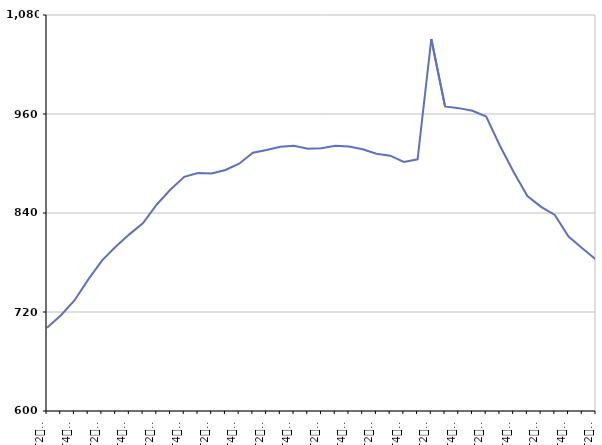
| Category | 50 ans ou plus |
|---|---|
| T2
2013 | 701 |
| T3
2013 | 715.7 |
| T4
2013 | 734 |
| T1
2014 | 759.2 |
| T2
2014 | 782.3 |
| T3
2014 | 799 |
| T4
2014 | 814.1 |
| T1
2015 | 827.8 |
| T2
2015 | 850.3 |
| T3
2015 | 868.4 |
| T4
2015 | 883.8 |
| T1
2016 | 888.4 |
| T2
2016 | 888 |
| T3
2016 | 892.2 |
| T4
2016 | 899.8 |
| T1
2017 | 913 |
| T2
2017 | 916.3 |
| T3
2017 | 920.4 |
| T4
2017 | 921.6 |
| T1
2018 | 917.8 |
| T2
2018 | 918.5 |
| T3
2018 | 921.6 |
| T4
2018 | 920.7 |
| T1
2019 | 917.2 |
| T2
2019 | 911.9 |
| T3
2019 | 909.5 |
| T4
2019 | 901.9 |
| T1
2020 | 905.1 |
| T2
2020 | 1050.9 |
| T3
2020 | 969.2 |
| T4
2020 | 967.1 |
| T1
2021 | 963.9 |
| T2
2021 | 956.9 |
| T3
2021 | 921.5 |
| T4
2021 | 889.6 |
| T1
2022 | 860.6 |
| T2
2022 | 847.4 |
| T3
2022 | 837.7 |
| T4
2022 | 811.4 |
| T1
2023 | 797.4 |
| T2
2023 | 783.5 |